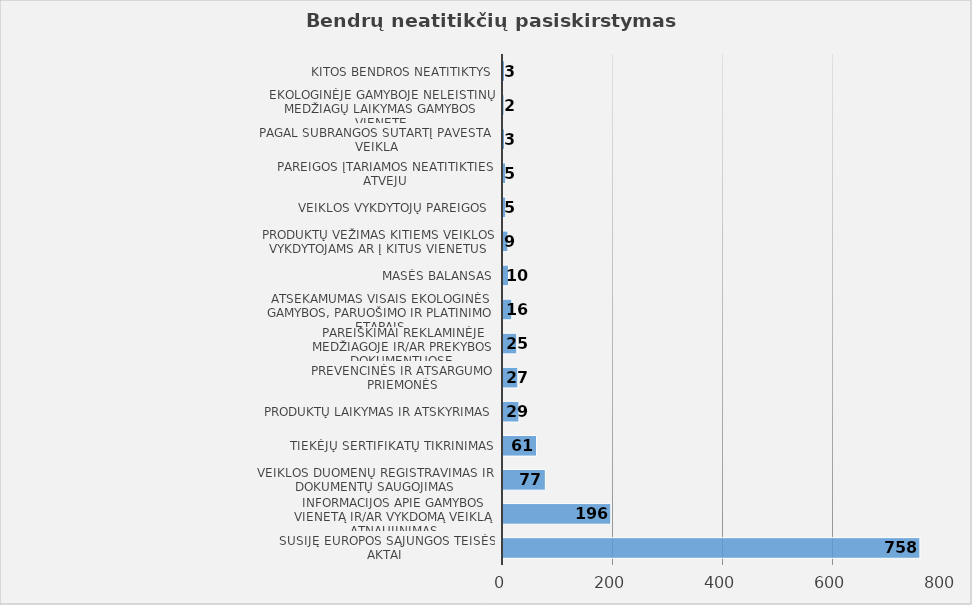
| Category | Series 0 |
|---|---|
| Susiję Europos Sąjungos teisės aktai  | 758 |
| Informacijos apie gamybos vienetą ir/ar vykdomą veiklą atnaujinimas | 196 |
| Veiklos duomenų registravimas ir dokumentų saugojimas | 77 |
| Tiekėjų sertifikatų tikrinimas | 61 |
| Produktų laikymas ir atskyrimas | 29 |
| Prevencinės ir atsargumo priemonės | 27 |
| Pareiškimai reklaminėje medžiagoje ir/ar prekybos dokumentuose | 25 |
| Atsekamumas visais ekologinės gamybos, paruošimo ir platinimo etapais | 16 |
| Masės balansas | 10 |
| Produktų vežimas kitiems veiklos vykdytojams ar į kitus vienetus | 9 |
| Veiklos vykdytojų pareigos  | 5 |
| Pareigos įtariamos neatitikties atveju | 5 |
| Pagal subrangos sutartį pavesta veikla | 3 |
| Ekologinėje gamyboje neleistinų medžiagų laikymas gamybos vienete | 2 |
| Kitos bendros neatitiktys | 3 |